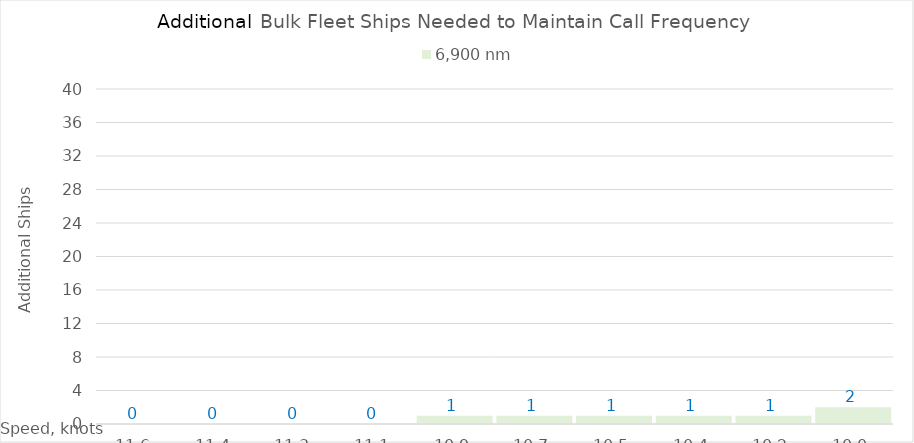
| Category | 6,900 |
|---|---|
| 11.620000000000001 | 0 |
| 11.440000000000001 | 0 |
| 11.260000000000002 | 0 |
| 11.080000000000002 | 0 |
| 10.900000000000002 | 1 |
| 10.720000000000002 | 1 |
| 10.540000000000003 | 1 |
| 10.360000000000003 | 1 |
| 10.180000000000003 | 1 |
| 10.000000000000004 | 2 |